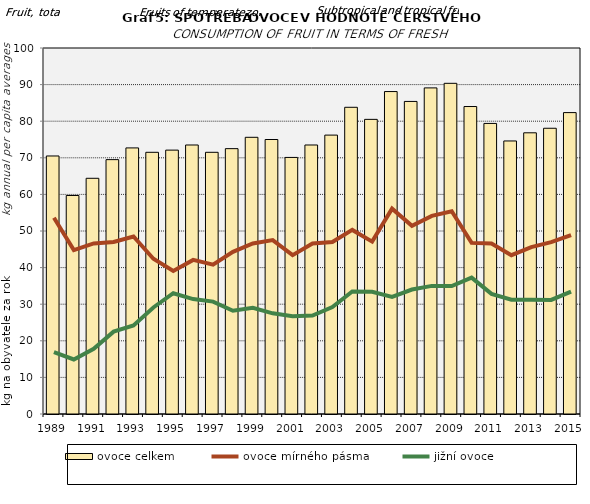
| Category | ovoce celkem |
|---|---|
| 1989.0 | 70.5 |
| 1990.0 | 59.7 |
| 1991.0 | 64.4 |
| 1992.0 | 69.5 |
| 1993.0 | 72.7 |
| 1994.0 | 71.5 |
| 1995.0 | 72.1 |
| 1996.0 | 73.5 |
| 1997.0 | 71.5 |
| 1998.0 | 72.5 |
| 1999.0 | 75.6 |
| 2000.0 | 75 |
| 2001.0 | 70.1 |
| 2002.0 | 73.5 |
| 2003.0 | 76.2 |
| 2004.0 | 83.8 |
| 2005.0 | 80.5 |
| 2006.0 | 88.1 |
| 2007.0 | 85.4 |
| 2008.0 | 89.1 |
| 2009.0 | 90.35 |
| 2010.0 | 84.01 |
| 2011.0 | 79.39 |
| 2012.0 | 74.6 |
| 2013.0 | 76.83 |
| 2014.0 | 78.07 |
| 2015.0 | 82.35 |